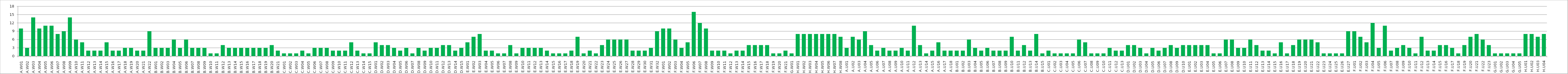
| Category | Series 0 |
|---|---|
| A.W01 | 10 |
| A.W02 | 3 |
| A.W03 | 14 |
| A.W04 | 10 |
| A.W05 | 11 |
| A.W06 | 11 |
| A.W07 | 8 |
| A.W08 | 9 |
| A.W09 | 14 |
| A.W10 | 6 |
| A.W11 | 5 |
| A.W12 | 2 |
| A.W13 | 2 |
| A.W14 | 2 |
| A.W15 | 5 |
| A.W16 | 2 |
| A.W17 | 2 |
| A.W18 | 3 |
| A.W19 | 3 |
| A.W20 | 2 |
| A.W21 | 2 |
| A.W22 | 9 |
| B.W01 | 3 |
| B.W02 | 3 |
| B.W03 | 3 |
| B.W04 | 6 |
| B.W05 | 3 |
| B.W06 | 6 |
| B.W07 | 3 |
| B.W08 | 3 |
| B.W09 | 3 |
| B.W10 | 1 |
| B.W11 | 1 |
| B.W12 | 4 |
| B.W13 | 3 |
| B.W14 | 3 |
| B.W15 | 3 |
| B.W16 | 3 |
| B.W17 | 3 |
| B.W18 | 3 |
| B.W19 | 3 |
| B.W20 | 4 |
| B.W21 | 2 |
| C.W01 | 1 |
| C.W02 | 1 |
| C.W03 | 1 |
| C.W04 | 2 |
| C.W05 | 1 |
| C.W06 | 3 |
| C.W07 | 3 |
| C.W08 | 3 |
| C.W09 | 2 |
| C.W10 | 2 |
| C.W11 | 2 |
| C.W12 | 5 |
| C.W13 | 2 |
| C.W14 | 1 |
| C.W15 | 1 |
| D.W01 | 5 |
| D.W02 | 4 |
| D.W03 | 4 |
| D.W04 | 3 |
| D.W05 | 2 |
| D.W06 | 3 |
| D.W07 | 1 |
| D.W08 | 3 |
| D.W09 | 2 |
| D.W10 | 3 |
| D.W11 | 3 |
| D.W12 | 4 |
| D.W13 | 4 |
| D.W14 | 2 |
| D.W15 | 3 |
| E.W01 | 5 |
| E.W02 | 7 |
| E.W03 | 8 |
| E.W04 | 2 |
| E.W05 | 2 |
| E.W06 | 1 |
| E.W07 | 1 |
| E.W08 | 4 |
| E.W09 | 1 |
| E.W10 | 3 |
| E.W11 | 3 |
| E.W12 | 3 |
| E.W13 | 3 |
| E.W14 | 2 |
| E.W15 | 1 |
| E.W16 | 1 |
| E.W17 | 1 |
| E.W18 | 2 |
| E.W19 | 7 |
| E.W20 | 1 |
| E.W21 | 2 |
| E.W22 | 1 |
| E.W23 | 4 |
| E.W24 | 6 |
| E.W25 | 6 |
| E.W26 | 6 |
| E.W27 | 6 |
| E.W28 | 2 |
| E.W29 | 2 |
| E.W30 | 2 |
| E.W31 | 3 |
| E.W32 | 9 |
| F.W01 | 10 |
| F.W02 | 10 |
| F.W03 | 6 |
| F.W04 | 3 |
| F.W05 | 5 |
| F.W06 | 16 |
| F.W07 | 12 |
| F.W08 | 10 |
| F.W09 | 2 |
| F.W10 | 2 |
| F.W11 | 2 |
| F.W12 | 1 |
| F.W13 | 2 |
| F.W14 | 2 |
| F.W15 | 4 |
| F.W16 | 4 |
| F.W17 | 4 |
| F.W18 | 4 |
| F.W19 | 1 |
| F.W20 | 1 |
| F.W21 | 2 |
| G.W01 | 1 |
| H.W01 | 8 |
| H.W02 | 8 |
| H.W03 | 8 |
| H.W04 | 8 |
| H.W05 | 8 |
| H.W06 | 8 |
| H.W07 | 8 |
| H.W08 | 7 |
| A.U01 | 3 |
| A.U02 | 7 |
| A.U03 | 6 |
| A.U04 | 9 |
| A.U05 | 4 |
| A.U06 | 2 |
| A.U07 | 3 |
| A.U08 | 2 |
| A.U09 | 2 |
| A.U10 | 3 |
| A.U11 | 2 |
| A.U12 | 11 |
| A.U13 | 4 |
| A.U14 | 1 |
| A.U15 | 2 |
| A.U16 | 5 |
| A.U17 | 2 |
| A.U18 | 2 |
| B.U01 | 2 |
| B.U02 | 2 |
| B.U03 | 6 |
| B.U04 | 3 |
| B.U05 | 2 |
| B.U06 | 3 |
| B.U07 | 2 |
| B.U08 | 2 |
| B.U09 | 2 |
| B.U10 | 7 |
| B.U11 | 2 |
| B.U12 | 4 |
| B.U13 | 2 |
| B.U14 | 8 |
| B.U15 | 1 |
| C.U01 | 2 |
| C.U02 | 1 |
| C.U03 | 1 |
| C.U04 | 1 |
| C.U05 | 1 |
| C.U06 | 6 |
| C.U07 | 5 |
| C.U08 | 1 |
| C.U09 | 1 |
| C.U10 | 1 |
| C.U11 | 3 |
| C.U12 | 2 |
| C.U13 | 2 |
| D.U01 | 4 |
| D.U02 | 4 |
| D.U03 | 3 |
| D.U04 | 1 |
| D.U05 | 3 |
| D.U06 | 2 |
| D.U07 | 3 |
| D.U08 | 4 |
| D.U09 | 3 |
| D.U10 | 4 |
| E.U01 | 4 |
| E.U02 | 4 |
| E.U03 | 4 |
| E.U04 | 4 |
| E.U05 | 1 |
| E.U06 | 1 |
| E.U07 | 6 |
| E.U08 | 6 |
| E.U09 | 3 |
| E.U10 | 3 |
| E.U11 | 6 |
| E.U12 | 4 |
| E.U13 | 2 |
| E.U14 | 2 |
| E.U15 | 1 |
| E.U16 | 5 |
| E.U17 | 1 |
| E.U18 | 4 |
| E.U19 | 6 |
| E.U20 | 6 |
| E.U21 | 6 |
| E.U22 | 5 |
| E.U23 | 1 |
| E.U24 | 1 |
| E.U25 | 1 |
| E.U26 | 1 |
| E.U27 | 9 |
| F.U01 | 9 |
| F.U02 | 7 |
| F.U03 | 5 |
| F.U04 | 12 |
| F.U05 | 3 |
| F.U06 | 11 |
| F.U07 | 2 |
| F.U08 | 3 |
| F.U09 | 4 |
| F.U10 | 3 |
| F.U11 | 1 |
| F.U12 | 7 |
| F.U13 | 2 |
| F.U14 | 2 |
| F.U15 | 4 |
| F.U16 | 4 |
| F.U17 | 3 |
| F.U18 | 1 |
| F.U19 | 4 |
| F.U20 | 7 |
| F.U21 | 8 |
| F.U22 | 6 |
| F.U23 | 4 |
| G.U01 | 1 |
| G.U02 | 1 |
| G.U03 | 1 |
| G.U04 | 1 |
| G.U05 | 1 |
| H.U01 | 8 |
| H.U02 | 8 |
| H.U03 | 7 |
| H.U04 | 8 |